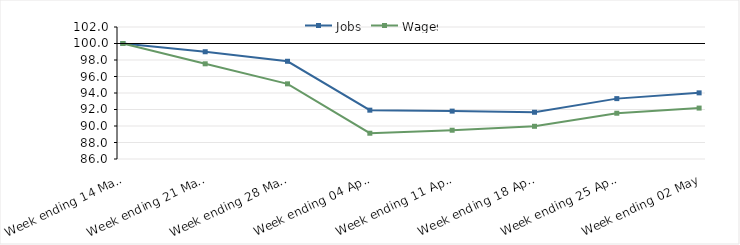
| Category | Jobs | Wages |
|---|---|---|
| 2020-03-14 | 100 | 100 |
| 2020-03-21 | 99 | 97.539 |
| 2020-03-28 | 97.846 | 95.11 |
| 2020-04-04 | 91.919 | 89.124 |
| 2020-04-11 | 91.803 | 89.489 |
| 2020-04-18 | 91.665 | 89.964 |
| 2020-04-25 | 93.319 | 91.548 |
| 2020-05-02 | 94.017 | 92.172 |